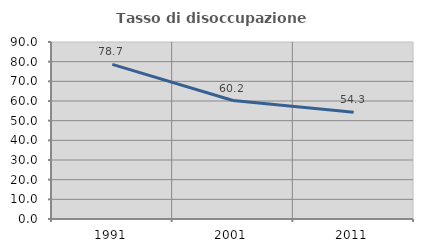
| Category | Tasso di disoccupazione giovanile  |
|---|---|
| 1991.0 | 78.654 |
| 2001.0 | 60.241 |
| 2011.0 | 54.327 |